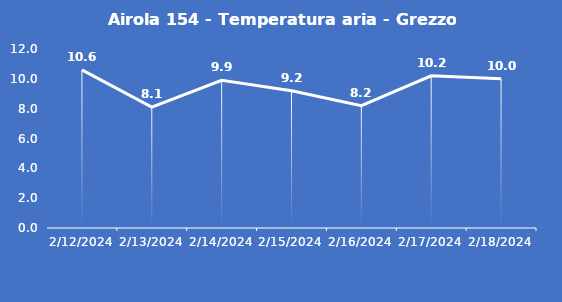
| Category | Airola 154 - Temperatura aria - Grezzo (°C) |
|---|---|
| 2/12/24 | 10.6 |
| 2/13/24 | 8.1 |
| 2/14/24 | 9.9 |
| 2/15/24 | 9.2 |
| 2/16/24 | 8.2 |
| 2/17/24 | 10.2 |
| 2/18/24 | 10 |